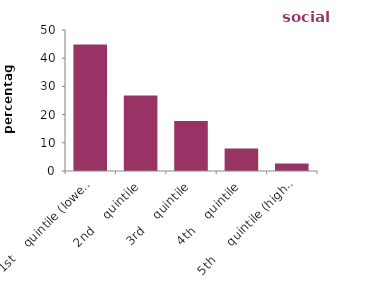
| Category | social renters |
|---|---|
| 1st    quintile (lowest incomes) | 44.877 |
| 2nd    quintile | 26.73 |
| 3rd    quintile | 17.716 |
| 4th    quintile | 8.019 |
| 5th     quintile (highest incomes) | 2.658 |